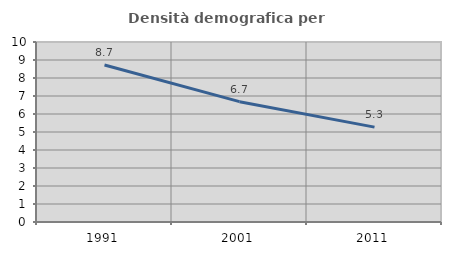
| Category | Densità demografica |
|---|---|
| 1991.0 | 8.718 |
| 2001.0 | 6.686 |
| 2011.0 | 5.272 |